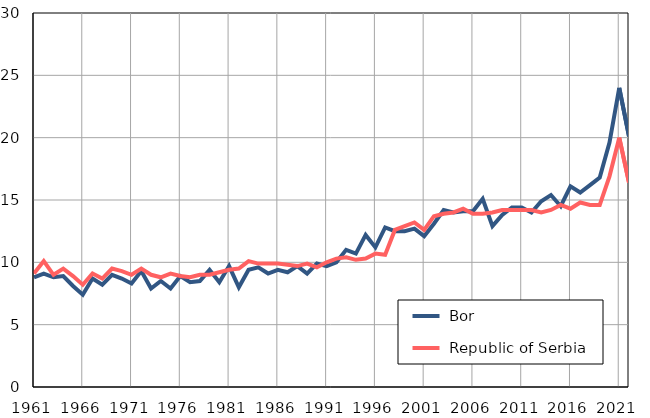
| Category |  Bor |  Republic of Serbia |
|---|---|---|
| 1961.0 | 8.8 | 9.1 |
| 1962.0 | 9.1 | 10.1 |
| 1963.0 | 8.8 | 9 |
| 1964.0 | 8.9 | 9.5 |
| 1965.0 | 8.1 | 8.9 |
| 1966.0 | 7.4 | 8.2 |
| 1967.0 | 8.7 | 9.1 |
| 1968.0 | 8.2 | 8.7 |
| 1969.0 | 9 | 9.5 |
| 1970.0 | 8.7 | 9.3 |
| 1971.0 | 8.3 | 9 |
| 1972.0 | 9.3 | 9.5 |
| 1973.0 | 7.9 | 9 |
| 1974.0 | 8.5 | 8.8 |
| 1975.0 | 7.9 | 9.1 |
| 1976.0 | 8.9 | 8.9 |
| 1977.0 | 8.4 | 8.8 |
| 1978.0 | 8.5 | 9 |
| 1979.0 | 9.4 | 9 |
| 1980.0 | 8.4 | 9.2 |
| 1981.0 | 9.7 | 9.4 |
| 1982.0 | 8 | 9.5 |
| 1983.0 | 9.4 | 10.1 |
| 1984.0 | 9.6 | 9.9 |
| 1985.0 | 9.1 | 9.9 |
| 1986.0 | 9.4 | 9.9 |
| 1987.0 | 9.2 | 9.8 |
| 1988.0 | 9.7 | 9.7 |
| 1989.0 | 9.1 | 9.9 |
| 1990.0 | 9.9 | 9.6 |
| 1991.0 | 9.7 | 10 |
| 1992.0 | 10 | 10.3 |
| 1993.0 | 11 | 10.4 |
| 1994.0 | 10.7 | 10.2 |
| 1995.0 | 12.2 | 10.3 |
| 1996.0 | 11.2 | 10.7 |
| 1997.0 | 12.8 | 10.6 |
| 1998.0 | 12.5 | 12.6 |
| 1999.0 | 12.5 | 12.9 |
| 2000.0 | 12.7 | 13.2 |
| 2001.0 | 12.1 | 12.6 |
| 2002.0 | 13.1 | 13.7 |
| 2003.0 | 14.2 | 13.9 |
| 2004.0 | 14 | 14 |
| 2005.0 | 14.1 | 14.3 |
| 2006.0 | 14.1 | 13.9 |
| 2007.0 | 15.1 | 13.9 |
| 2008.0 | 12.9 | 14 |
| 2009.0 | 13.8 | 14.2 |
| 2010.0 | 14.4 | 14.2 |
| 2011.0 | 14.4 | 14.2 |
| 2012.0 | 14 | 14.2 |
| 2013.0 | 14.9 | 14 |
| 2014.0 | 15.4 | 14.2 |
| 2015.0 | 14.5 | 14.6 |
| 2016.0 | 16.1 | 14.3 |
| 2017.0 | 15.6 | 14.8 |
| 2018.0 | 16.2 | 14.6 |
| 2019.0 | 16.8 | 14.6 |
| 2020.0 | 19.6 | 16.9 |
| 2021.0 | 24 | 20 |
| 2022.0 | 20.1 | 16.4 |